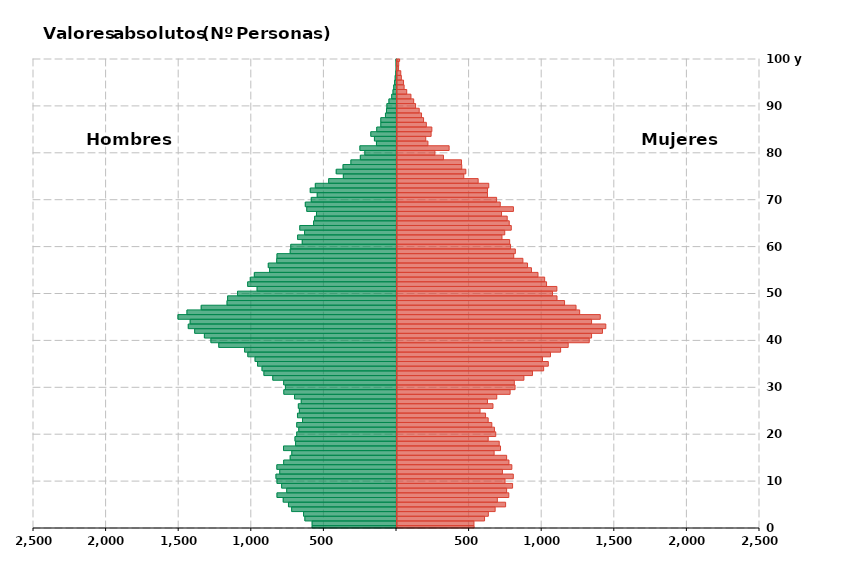
| Category | Hombres | Mujeres |
|---|---|---|
| 0 | -581 | 531 |
| 1 | -581 | 530 |
| 2 | -631 | 603 |
| 3 | -640 | 629 |
| 4 | -722 | 676 |
| 5 | -744 | 748 |
| 6 | -780 | 691 |
| 7 | -823 | 770 |
| 8 | -756 | 755 |
| 9 | -791 | 796 |
| 10 | -823 | 744 |
| 11 | -830 | 801 |
| 12 | -804 | 726 |
| 13 | -824 | 791 |
| 14 | -777 | 771 |
| 15 | -732 | 755 |
| 16 | -721 | 669 |
| 17 | -778 | 713 |
| 18 | -695 | 704 |
| 19 | -699 | 628 |
| 20 | -687 | 680 |
| 21 | -673 | 671 |
| 22 | -687 | 653 |
| 23 | -647 | 628 |
| 24 | -682 | 610 |
| 25 | -669 | 572 |
| 26 | -676 | 661 |
| 27 | -656 | 623 |
| 28 | -702 | 687 |
| 29 | -776 | 779 |
| 30 | -765 | 813 |
| 31 | -777 | 808 |
| 32 | -852 | 874 |
| 33 | -913 | 933 |
| 34 | -926 | 1010 |
| 35 | -957 | 1042 |
| 36 | -974 | 1002 |
| 37 | -1024 | 1057 |
| 38 | -1046 | 1127 |
| 39 | -1224 | 1179 |
| 40 | -1278 | 1324 |
| 41 | -1323 | 1340 |
| 42 | -1390 | 1415 |
| 43 | -1434 | 1438 |
| 44 | -1421 | 1340 |
| 45 | -1505 | 1400 |
| 46 | -1443 | 1258 |
| 47 | -1345 | 1233 |
| 48 | -1167 | 1154 |
| 49 | -1163 | 1102 |
| 50 | -1095 | 1071 |
| 51 | -960 | 1101 |
| 52 | -1025 | 1030 |
| 53 | -1007 | 1017 |
| 54 | -979 | 971 |
| 55 | -874 | 926 |
| 56 | -883 | 899 |
| 57 | -825 | 867 |
| 58 | -823 | 804 |
| 59 | -732 | 815 |
| 60 | -728 | 782 |
| 61 | -649 | 776 |
| 62 | -681 | 723 |
| 63 | -633 | 742 |
| 64 | -666 | 787 |
| 65 | -571 | 773 |
| 66 | -564 | 759 |
| 67 | -551 | 720 |
| 68 | -618 | 802 |
| 69 | -628 | 711 |
| 70 | -587 | 686 |
| 71 | -546 | 623 |
| 72 | -594 | 623 |
| 73 | -559 | 632 |
| 74 | -467 | 559 |
| 75 | -366 | 460 |
| 76 | -415 | 474 |
| 77 | -368 | 446 |
| 78 | -314 | 444 |
| 79 | -249 | 320 |
| 80 | -218 | 261 |
| 81 | -252 | 359 |
| 82 | -138 | 213 |
| 83 | -152 | 198 |
| 84 | -177 | 235 |
| 85 | -136 | 240 |
| 86 | -108 | 202 |
| 87 | -108 | 183 |
| 88 | -76 | 169 |
| 89 | -69 | 153 |
| 90 | -66 | 128 |
| 91 | -52 | 115 |
| 92 | -33 | 96 |
| 93 | -24 | 67 |
| 94 | -19 | 49 |
| 95 | -13 | 45 |
| 96 | -9 | 30 |
| 97 | -5 | 26 |
| 98 | -3 | 11 |
| 99 | -3 | 12 |
| 100 | -4 | 18 |